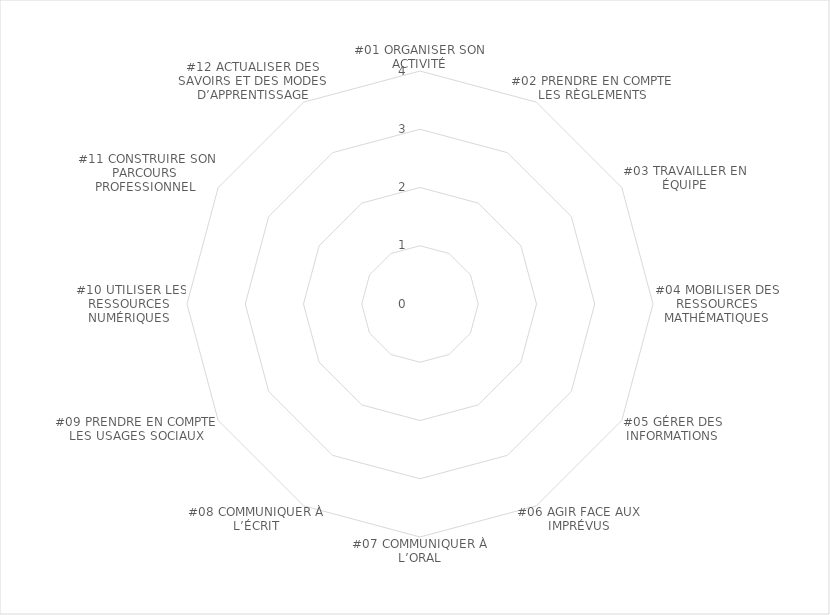
| Category | Series 0 |
|---|---|
| #01 ORGANISER SON ACTIVITÉ | 0 |
| #02 PRENDRE EN COMPTE LES RÈGLEMENTS | 0 |
| #03 TRAVAILLER EN ÉQUIPE | 0 |
| #04 MOBILISER DES RESSOURCES MATHÉMATIQUES | 0 |
| #05 GÉRER DES INFORMATIONS | 0 |
| #06 AGIR FACE AUX IMPRÉVUS | 0 |
| #07 COMMUNIQUER À L’ORAL | 0 |
| #08 COMMUNIQUER À L’ÉCRIT | 0 |
| #09 PRENDRE EN COMPTE LES USAGES SOCIAUX | 0 |
|  #10 UTILISER LES RESSOURCES NUMÉRIQUES | 0 |
|  #11 CONSTRUIRE SON PARCOURS PROFESSIONNEL | 0 |
| #12 ACTUALISER DES SAVOIRS ET DES MODES D’APPRENTISSAGE | 0 |